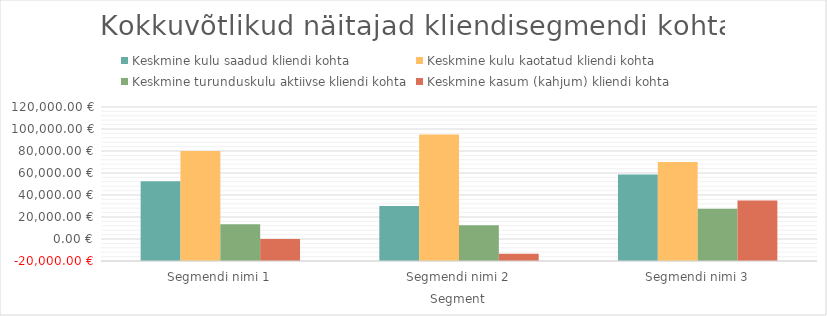
| Category | Keskmine kulu saadud kliendi kohta | Keskmine kulu kaotatud kliendi kohta | Keskmine turunduskulu aktiivse kliendi kohta | Keskmine kasum (kahjum) kliendi kohta |
|---|---|---|---|---|
| Segmendi nimi 1 | 52500 | 80000 | 13333.333 | 0 |
| Segmendi nimi 2 | 30000 | 95000 | 12500 | -13500 |
| Segmendi nimi 3 | 58750 | 70000 | 27500 | 35000 |